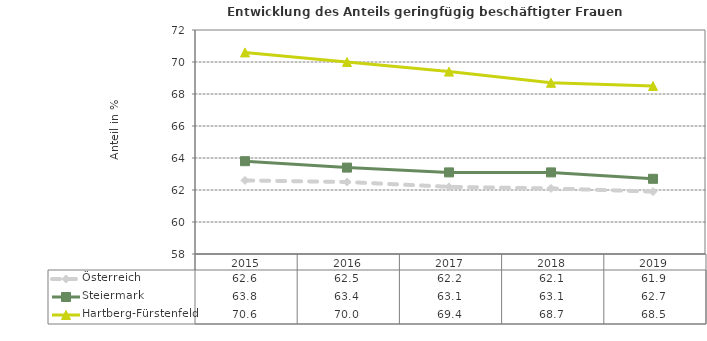
| Category | Österreich | Steiermark | Hartberg-Fürstenfeld |
|---|---|---|---|
| 2019.0 | 61.9 | 62.7 | 68.5 |
| 2018.0 | 62.1 | 63.1 | 68.7 |
| 2017.0 | 62.2 | 63.1 | 69.4 |
| 2016.0 | 62.5 | 63.4 | 70 |
| 2015.0 | 62.6 | 63.8 | 70.6 |